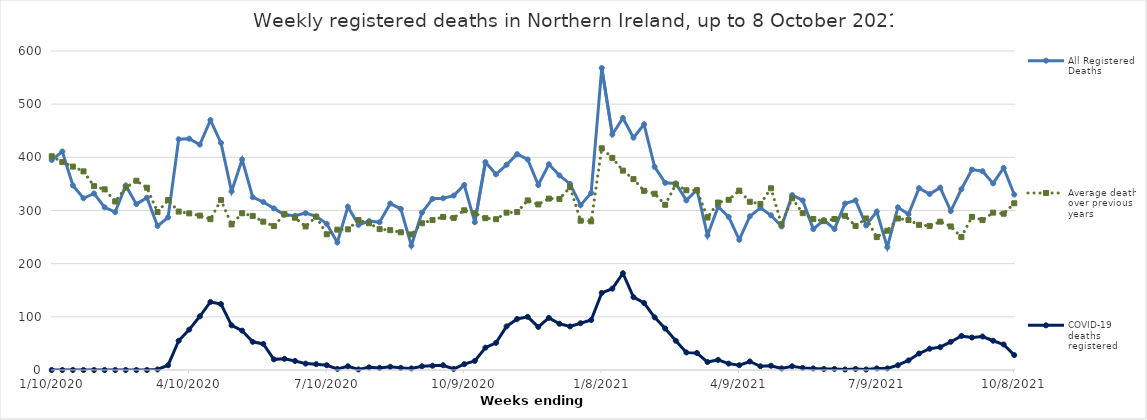
| Category | All Registered Deaths | Average deaths over previous 5 years | COVID-19 deaths registered |
|---|---|---|---|
| 1/10/20 | 395 | 402 | 0 |
| 1/17/20 | 411 | 391 | 0 |
| 1/24/20 | 347 | 382.6 | 0 |
| 1/31/20 | 323 | 373.6 | 0 |
| 2/7/20 | 332 | 345.8 | 0 |
| 2/14/20 | 306 | 339.8 | 0 |
| 2/21/20 | 297 | 317 | 0 |
| 2/28/20 | 347 | 343 | 0 |
| 3/6/20 | 312 | 356 | 0 |
| 3/13/20 | 324 | 342.8 | 0 |
| 3/20/20 | 271 | 297.2 | 1 |
| 3/27/20 | 287 | 319.6 | 9 |
| 4/3/20 | 434 | 298 | 55 |
| 4/10/20 | 435 | 294.6 | 76 |
| 4/17/20 | 424 | 290.4 | 101 |
| 4/24/20 | 470 | 283.8 | 128 |
| 5/1/20 | 427 | 319.6 | 124 |
| 5/8/20 | 336 | 273.8 | 84 |
| 5/15/20 | 396 | 294.8 | 74 |
| 5/22/20 | 325 | 289.8 | 53 |
| 5/29/20 | 316 | 279 | 49 |
| 6/5/20 | 304 | 270.6 | 20 |
| 6/12/20 | 292 | 293.2 | 21 |
| 6/19/20 | 290 | 286.4 | 17 |
| 6/26/20 | 295 | 270 | 12 |
| 7/3/20 | 289 | 288.2 | 11 |
| 7/10/20 | 275 | 255.2 | 9 |
| 7/17/20 | 240 | 264 | 2 |
| 7/24/20 | 307 | 264.6 | 7 |
| 7/31/20 | 273 | 282 | 1 |
| 8/7/20 | 280 | 276 | 5 |
| 8/14/20 | 278 | 265 | 4 |
| 8/21/20 | 313 | 263 | 6 |
| 8/28/20 | 303 | 259 | 4 |
| 9/4/20 | 234 | 255 | 3 |
| 9/11/20 | 296 | 276 | 7 |
| 9/18/20 | 322 | 282 | 8 |
| 9/25/20 | 323 | 288 | 9 |
| 10/2/20 | 328 | 286 | 2 |
| 10/9/20 | 348 | 300.4 | 11 |
| 10/16/20 | 278 | 294.8 | 17 |
| 10/23/20 | 391 | 285.6 | 42 |
| 10/30/20 | 368 | 283.6 | 51 |
| 11/6/20 | 386 | 296 | 82 |
| 11/13/20 | 406 | 297 | 96 |
| 11/20/20 | 396 | 319 | 100 |
| 11/27/20 | 348 | 311.4 | 81 |
| 12/4/20 | 387 | 322.4 | 98 |
| 12/11/20 | 366 | 321.8 | 87 |
| 12/18/20 | 350 | 343.8 | 82 |
| 12/25/20 | 310 | 280.8 | 88 |
| 1/1/21 | 333 | 279.6 | 94 |
| 1/8/21 | 568 | 417 | 145 |
| 1/15/21 | 443 | 399 | 153 |
| 1/22/21 | 474 | 375 | 182 |
| 1/29/21 | 437 | 359 | 137 |
| 2/5/21 | 462 | 337 | 126 |
| 2/12/21 | 382 | 331.6 | 99 |
| 2/19/21 | 352 | 310.8 | 78 |
| 2/26/21 | 351 | 349 | 55 |
| 3/5/21 | 319 | 338 | 33 |
| 3/12/21 | 339 | 338 | 32 |
| 3/19/21 | 253 | 286.8 | 15 |
| 3/26/21 | 307 | 315 | 19 |
| 4/2/21 | 288 | 320.2 | 12 |
| 4/9/21 | 245 | 337.4 | 9 |
| 4/16/21 | 289 | 316.4 | 16 |
| 4/23/21 | 305 | 312.4 | 7 |
| 4/30/21 | 291 | 341.8 | 8 |
| 5/7/21 | 270 | 274 | 3 |
| 5/14/21 | 329 | 323 | 7 |
| 5/21/21 | 319 | 295 | 4 |
| 5/28/21 | 265 | 284 | 3 |
| 6/4/21 | 282 | 280 | 2 |
| 6/11/21 | 265 | 284 | 2 |
| 6/18/21 | 313 | 290 | 1 |
| 6/25/21 | 319 | 271 | 2 |
| 7/2/21 | 272 | 285 | 1 |
| 7/9/21 | 298 | 250 | 3 |
| 7/16/21 | 231 | 262 | 3 |
| 7/23/21 | 306 | 285 | 9 |
| 7/30/21 | 293 | 282 | 18 |
| 8/6/21 | 342 | 273 | 31 |
| 8/13/21 | 331 | 271 | 40 |
| 8/20/21 | 343 | 279 | 43 |
| 8/27/21 | 299 | 270 | 53 |
| 9/3/21 | 340 | 250 | 64 |
| 9/10/21 | 377 | 288 | 61 |
| 9/17/21 | 374 | 282 | 63 |
| 9/24/21 | 351 | 296 | 55 |
| 10/1/21 | 380 | 294 | 48 |
| 10/8/21 | 330 | 313.6 | 28 |